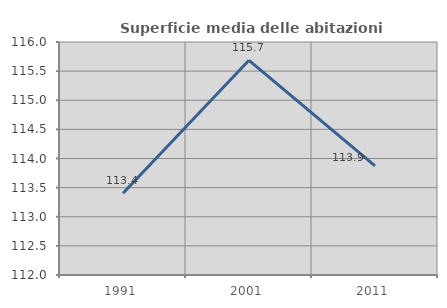
| Category | Superficie media delle abitazioni occupate |
|---|---|
| 1991.0 | 113.405 |
| 2001.0 | 115.686 |
| 2011.0 | 113.873 |